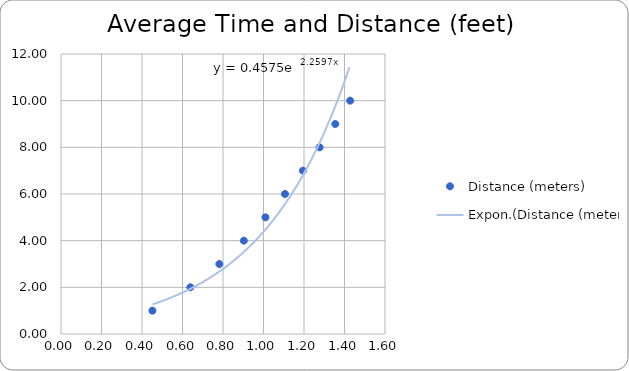
| Category | Distance (meters) |
|---|---|
| 0.4515236409857309 | 1 |
| 0.638550856814101 | 2 |
| 0.7820618870057751 | 3 |
| 0.9030472819714618 | 4 |
| 1.0096375546923044 | 5 |
| 1.106002527218662 | 6 |
| 1.194619265114655 | 7 |
| 1.277101713628202 | 8 |
| 1.3545709229571927 | 9 |
| 1.4278431229270645 | 10 |